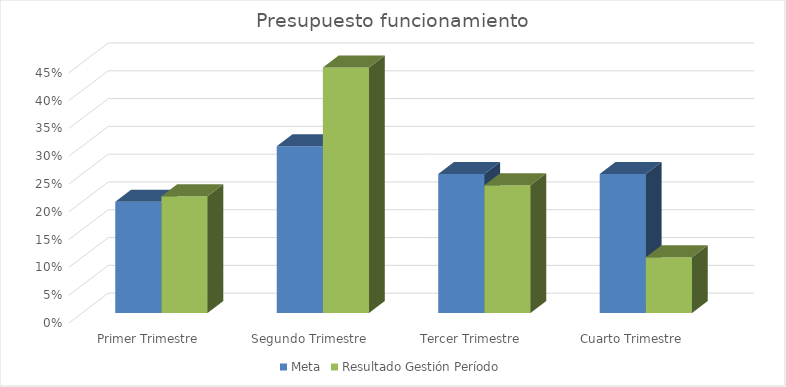
| Category | Meta | Resultado Gestión Período |
|---|---|---|
| Primer Trimestre | 0.2 | 0.21 |
| Segundo Trimestre | 0.3 | 0.442 |
| Tercer Trimestre | 0.25 | 0.23 |
| Cuarto Trimestre | 0.25 | 0.1 |